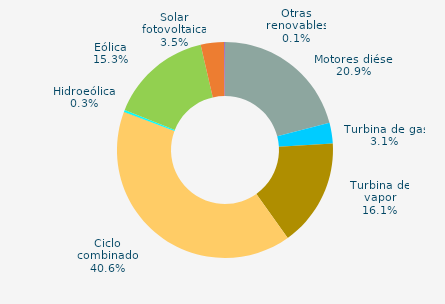
| Category | Series 0 |
|---|---|
| Motores diésel | 20.928 |
| Turbina de gas | 3.131 |
| Turbina de vapor | 16.084 |
| Ciclo combinado | 40.569 |
| Cogeneración | 0 |
| Hidráulica | 0.042 |
| Hidroeólica | 0.299 |
| Eólica | 15.325 |
| Solar fotovoltaica | 3.495 |
| Otras renovables | 0.128 |